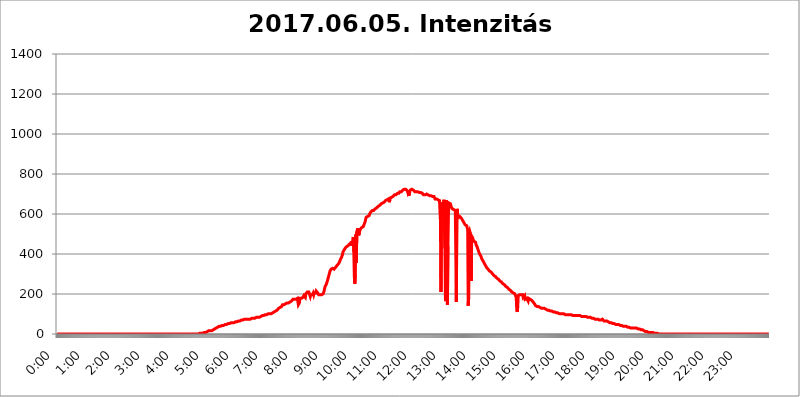
| Category | 2017.06.05. Intenzitás [W/m^2] |
|---|---|
| 0.0 | 0 |
| 0.0006944444444444445 | 0 |
| 0.001388888888888889 | 0 |
| 0.0020833333333333333 | 0 |
| 0.002777777777777778 | 0 |
| 0.003472222222222222 | 0 |
| 0.004166666666666667 | 0 |
| 0.004861111111111111 | 0 |
| 0.005555555555555556 | 0 |
| 0.0062499999999999995 | 0 |
| 0.006944444444444444 | 0 |
| 0.007638888888888889 | 0 |
| 0.008333333333333333 | 0 |
| 0.009027777777777779 | 0 |
| 0.009722222222222222 | 0 |
| 0.010416666666666666 | 0 |
| 0.011111111111111112 | 0 |
| 0.011805555555555555 | 0 |
| 0.012499999999999999 | 0 |
| 0.013194444444444444 | 0 |
| 0.013888888888888888 | 0 |
| 0.014583333333333332 | 0 |
| 0.015277777777777777 | 0 |
| 0.015972222222222224 | 0 |
| 0.016666666666666666 | 0 |
| 0.017361111111111112 | 0 |
| 0.018055555555555557 | 0 |
| 0.01875 | 0 |
| 0.019444444444444445 | 0 |
| 0.02013888888888889 | 0 |
| 0.020833333333333332 | 0 |
| 0.02152777777777778 | 0 |
| 0.022222222222222223 | 0 |
| 0.02291666666666667 | 0 |
| 0.02361111111111111 | 0 |
| 0.024305555555555556 | 0 |
| 0.024999999999999998 | 0 |
| 0.025694444444444447 | 0 |
| 0.02638888888888889 | 0 |
| 0.027083333333333334 | 0 |
| 0.027777777777777776 | 0 |
| 0.02847222222222222 | 0 |
| 0.029166666666666664 | 0 |
| 0.029861111111111113 | 0 |
| 0.030555555555555555 | 0 |
| 0.03125 | 0 |
| 0.03194444444444445 | 0 |
| 0.03263888888888889 | 0 |
| 0.03333333333333333 | 0 |
| 0.034027777777777775 | 0 |
| 0.034722222222222224 | 0 |
| 0.035416666666666666 | 0 |
| 0.036111111111111115 | 0 |
| 0.03680555555555556 | 0 |
| 0.0375 | 0 |
| 0.03819444444444444 | 0 |
| 0.03888888888888889 | 0 |
| 0.03958333333333333 | 0 |
| 0.04027777777777778 | 0 |
| 0.04097222222222222 | 0 |
| 0.041666666666666664 | 0 |
| 0.042361111111111106 | 0 |
| 0.04305555555555556 | 0 |
| 0.043750000000000004 | 0 |
| 0.044444444444444446 | 0 |
| 0.04513888888888889 | 0 |
| 0.04583333333333334 | 0 |
| 0.04652777777777778 | 0 |
| 0.04722222222222222 | 0 |
| 0.04791666666666666 | 0 |
| 0.04861111111111111 | 0 |
| 0.049305555555555554 | 0 |
| 0.049999999999999996 | 0 |
| 0.05069444444444445 | 0 |
| 0.051388888888888894 | 0 |
| 0.052083333333333336 | 0 |
| 0.05277777777777778 | 0 |
| 0.05347222222222222 | 0 |
| 0.05416666666666667 | 0 |
| 0.05486111111111111 | 0 |
| 0.05555555555555555 | 0 |
| 0.05625 | 0 |
| 0.05694444444444444 | 0 |
| 0.057638888888888885 | 0 |
| 0.05833333333333333 | 0 |
| 0.05902777777777778 | 0 |
| 0.059722222222222225 | 0 |
| 0.06041666666666667 | 0 |
| 0.061111111111111116 | 0 |
| 0.06180555555555556 | 0 |
| 0.0625 | 0 |
| 0.06319444444444444 | 0 |
| 0.06388888888888888 | 0 |
| 0.06458333333333334 | 0 |
| 0.06527777777777778 | 0 |
| 0.06597222222222222 | 0 |
| 0.06666666666666667 | 0 |
| 0.06736111111111111 | 0 |
| 0.06805555555555555 | 0 |
| 0.06874999999999999 | 0 |
| 0.06944444444444443 | 0 |
| 0.07013888888888889 | 0 |
| 0.07083333333333333 | 0 |
| 0.07152777777777779 | 0 |
| 0.07222222222222223 | 0 |
| 0.07291666666666667 | 0 |
| 0.07361111111111111 | 0 |
| 0.07430555555555556 | 0 |
| 0.075 | 0 |
| 0.07569444444444444 | 0 |
| 0.0763888888888889 | 0 |
| 0.07708333333333334 | 0 |
| 0.07777777777777778 | 0 |
| 0.07847222222222222 | 0 |
| 0.07916666666666666 | 0 |
| 0.0798611111111111 | 0 |
| 0.08055555555555556 | 0 |
| 0.08125 | 0 |
| 0.08194444444444444 | 0 |
| 0.08263888888888889 | 0 |
| 0.08333333333333333 | 0 |
| 0.08402777777777777 | 0 |
| 0.08472222222222221 | 0 |
| 0.08541666666666665 | 0 |
| 0.08611111111111112 | 0 |
| 0.08680555555555557 | 0 |
| 0.08750000000000001 | 0 |
| 0.08819444444444445 | 0 |
| 0.08888888888888889 | 0 |
| 0.08958333333333333 | 0 |
| 0.09027777777777778 | 0 |
| 0.09097222222222222 | 0 |
| 0.09166666666666667 | 0 |
| 0.09236111111111112 | 0 |
| 0.09305555555555556 | 0 |
| 0.09375 | 0 |
| 0.09444444444444444 | 0 |
| 0.09513888888888888 | 0 |
| 0.09583333333333333 | 0 |
| 0.09652777777777777 | 0 |
| 0.09722222222222222 | 0 |
| 0.09791666666666667 | 0 |
| 0.09861111111111111 | 0 |
| 0.09930555555555555 | 0 |
| 0.09999999999999999 | 0 |
| 0.10069444444444443 | 0 |
| 0.1013888888888889 | 0 |
| 0.10208333333333335 | 0 |
| 0.10277777777777779 | 0 |
| 0.10347222222222223 | 0 |
| 0.10416666666666667 | 0 |
| 0.10486111111111111 | 0 |
| 0.10555555555555556 | 0 |
| 0.10625 | 0 |
| 0.10694444444444444 | 0 |
| 0.1076388888888889 | 0 |
| 0.10833333333333334 | 0 |
| 0.10902777777777778 | 0 |
| 0.10972222222222222 | 0 |
| 0.1111111111111111 | 0 |
| 0.11180555555555556 | 0 |
| 0.11180555555555556 | 0 |
| 0.1125 | 0 |
| 0.11319444444444444 | 0 |
| 0.11388888888888889 | 0 |
| 0.11458333333333333 | 0 |
| 0.11527777777777777 | 0 |
| 0.11597222222222221 | 0 |
| 0.11666666666666665 | 0 |
| 0.1173611111111111 | 0 |
| 0.11805555555555557 | 0 |
| 0.11944444444444445 | 0 |
| 0.12013888888888889 | 0 |
| 0.12083333333333333 | 0 |
| 0.12152777777777778 | 0 |
| 0.12222222222222223 | 0 |
| 0.12291666666666667 | 0 |
| 0.12291666666666667 | 0 |
| 0.12361111111111112 | 0 |
| 0.12430555555555556 | 0 |
| 0.125 | 0 |
| 0.12569444444444444 | 0 |
| 0.12638888888888888 | 0 |
| 0.12708333333333333 | 0 |
| 0.16875 | 0 |
| 0.12847222222222224 | 0 |
| 0.12916666666666668 | 0 |
| 0.12986111111111112 | 0 |
| 0.13055555555555556 | 0 |
| 0.13125 | 0 |
| 0.13194444444444445 | 0 |
| 0.1326388888888889 | 0 |
| 0.13333333333333333 | 0 |
| 0.13402777777777777 | 0 |
| 0.13402777777777777 | 0 |
| 0.13472222222222222 | 0 |
| 0.13541666666666666 | 0 |
| 0.1361111111111111 | 0 |
| 0.13749999999999998 | 0 |
| 0.13819444444444443 | 0 |
| 0.1388888888888889 | 0 |
| 0.13958333333333334 | 0 |
| 0.14027777777777778 | 0 |
| 0.14097222222222222 | 0 |
| 0.14166666666666666 | 0 |
| 0.1423611111111111 | 0 |
| 0.14305555555555557 | 0 |
| 0.14375000000000002 | 0 |
| 0.14444444444444446 | 0 |
| 0.1451388888888889 | 0 |
| 0.1451388888888889 | 0 |
| 0.14652777777777778 | 0 |
| 0.14722222222222223 | 0 |
| 0.14791666666666667 | 0 |
| 0.1486111111111111 | 0 |
| 0.14930555555555555 | 0 |
| 0.15 | 0 |
| 0.15069444444444444 | 0 |
| 0.15138888888888888 | 0 |
| 0.15208333333333332 | 0 |
| 0.15277777777777776 | 0 |
| 0.15347222222222223 | 0 |
| 0.15416666666666667 | 0 |
| 0.15486111111111112 | 0 |
| 0.15555555555555556 | 0 |
| 0.15625 | 0 |
| 0.15694444444444444 | 0 |
| 0.15763888888888888 | 0 |
| 0.15833333333333333 | 0 |
| 0.15902777777777777 | 0 |
| 0.15972222222222224 | 0 |
| 0.16041666666666668 | 0 |
| 0.16111111111111112 | 0 |
| 0.16180555555555556 | 0 |
| 0.1625 | 0 |
| 0.16319444444444445 | 0 |
| 0.1638888888888889 | 0 |
| 0.16458333333333333 | 0 |
| 0.16527777777777777 | 0 |
| 0.16597222222222222 | 0 |
| 0.16666666666666666 | 0 |
| 0.1673611111111111 | 0 |
| 0.16805555555555554 | 0 |
| 0.16874999999999998 | 0 |
| 0.16944444444444443 | 0 |
| 0.17013888888888887 | 0 |
| 0.1708333333333333 | 0 |
| 0.17152777777777775 | 0 |
| 0.17222222222222225 | 0 |
| 0.1729166666666667 | 0 |
| 0.17361111111111113 | 0 |
| 0.17430555555555557 | 0 |
| 0.17500000000000002 | 0 |
| 0.17569444444444446 | 0 |
| 0.1763888888888889 | 0 |
| 0.17708333333333334 | 0 |
| 0.17777777777777778 | 0 |
| 0.17847222222222223 | 0 |
| 0.17916666666666667 | 0 |
| 0.1798611111111111 | 0 |
| 0.18055555555555555 | 0 |
| 0.18125 | 0 |
| 0.18194444444444444 | 0 |
| 0.1826388888888889 | 0 |
| 0.18333333333333335 | 0 |
| 0.1840277777777778 | 0 |
| 0.18472222222222223 | 0 |
| 0.18541666666666667 | 0 |
| 0.18611111111111112 | 0 |
| 0.18680555555555556 | 0 |
| 0.1875 | 0 |
| 0.18819444444444444 | 0 |
| 0.18888888888888888 | 0 |
| 0.18958333333333333 | 0 |
| 0.19027777777777777 | 0 |
| 0.1909722222222222 | 0 |
| 0.19166666666666665 | 0 |
| 0.19236111111111112 | 0 |
| 0.19305555555555554 | 0 |
| 0.19375 | 0 |
| 0.19444444444444445 | 0 |
| 0.1951388888888889 | 0 |
| 0.19583333333333333 | 0 |
| 0.19652777777777777 | 0 |
| 0.19722222222222222 | 0 |
| 0.19791666666666666 | 0 |
| 0.1986111111111111 | 0 |
| 0.19930555555555554 | 3.525 |
| 0.19999999999999998 | 3.525 |
| 0.20069444444444443 | 3.525 |
| 0.20138888888888887 | 3.525 |
| 0.2020833333333333 | 3.525 |
| 0.2027777777777778 | 3.525 |
| 0.2034722222222222 | 3.525 |
| 0.2041666666666667 | 3.525 |
| 0.20486111111111113 | 3.525 |
| 0.20555555555555557 | 7.887 |
| 0.20625000000000002 | 7.887 |
| 0.20694444444444446 | 7.887 |
| 0.2076388888888889 | 7.887 |
| 0.20833333333333334 | 7.887 |
| 0.20902777777777778 | 7.887 |
| 0.20972222222222223 | 12.257 |
| 0.21041666666666667 | 12.257 |
| 0.2111111111111111 | 12.257 |
| 0.21180555555555555 | 16.636 |
| 0.2125 | 16.636 |
| 0.21319444444444444 | 16.636 |
| 0.2138888888888889 | 16.636 |
| 0.21458333333333335 | 16.636 |
| 0.2152777777777778 | 16.636 |
| 0.21597222222222223 | 16.636 |
| 0.21666666666666667 | 16.636 |
| 0.21736111111111112 | 16.636 |
| 0.21805555555555556 | 21.024 |
| 0.21875 | 21.024 |
| 0.21944444444444444 | 21.024 |
| 0.22013888888888888 | 21.024 |
| 0.22083333333333333 | 25.419 |
| 0.22152777777777777 | 29.823 |
| 0.2222222222222222 | 29.823 |
| 0.22291666666666665 | 29.823 |
| 0.2236111111111111 | 29.823 |
| 0.22430555555555556 | 34.234 |
| 0.225 | 34.234 |
| 0.22569444444444445 | 34.234 |
| 0.2263888888888889 | 34.234 |
| 0.22708333333333333 | 38.653 |
| 0.22777777777777777 | 38.653 |
| 0.22847222222222222 | 38.653 |
| 0.22916666666666666 | 38.653 |
| 0.2298611111111111 | 38.653 |
| 0.23055555555555554 | 38.653 |
| 0.23124999999999998 | 43.079 |
| 0.23194444444444443 | 43.079 |
| 0.23263888888888887 | 43.079 |
| 0.2333333333333333 | 43.079 |
| 0.2340277777777778 | 43.079 |
| 0.2347222222222222 | 47.511 |
| 0.2354166666666667 | 47.511 |
| 0.23611111111111113 | 47.511 |
| 0.23680555555555557 | 47.511 |
| 0.23750000000000002 | 47.511 |
| 0.23819444444444446 | 47.511 |
| 0.2388888888888889 | 51.951 |
| 0.23958333333333334 | 51.951 |
| 0.24027777777777778 | 51.951 |
| 0.24097222222222223 | 51.951 |
| 0.24166666666666667 | 51.951 |
| 0.2423611111111111 | 51.951 |
| 0.24305555555555555 | 56.398 |
| 0.24375 | 56.398 |
| 0.24444444444444446 | 56.398 |
| 0.24513888888888888 | 56.398 |
| 0.24583333333333335 | 56.398 |
| 0.2465277777777778 | 56.398 |
| 0.24722222222222223 | 56.398 |
| 0.24791666666666667 | 56.398 |
| 0.24861111111111112 | 60.85 |
| 0.24930555555555556 | 60.85 |
| 0.25 | 60.85 |
| 0.25069444444444444 | 60.85 |
| 0.2513888888888889 | 60.85 |
| 0.2520833333333333 | 60.85 |
| 0.25277777777777777 | 65.31 |
| 0.2534722222222222 | 65.31 |
| 0.25416666666666665 | 65.31 |
| 0.2548611111111111 | 65.31 |
| 0.2555555555555556 | 65.31 |
| 0.25625000000000003 | 65.31 |
| 0.2569444444444445 | 65.31 |
| 0.2576388888888889 | 65.31 |
| 0.25833333333333336 | 69.775 |
| 0.2590277777777778 | 69.775 |
| 0.25972222222222224 | 69.775 |
| 0.2604166666666667 | 69.775 |
| 0.2611111111111111 | 69.775 |
| 0.26180555555555557 | 69.775 |
| 0.2625 | 74.246 |
| 0.26319444444444445 | 74.246 |
| 0.2638888888888889 | 74.246 |
| 0.26458333333333334 | 74.246 |
| 0.2652777777777778 | 74.246 |
| 0.2659722222222222 | 74.246 |
| 0.26666666666666666 | 74.246 |
| 0.2673611111111111 | 74.246 |
| 0.26805555555555555 | 74.246 |
| 0.26875 | 74.246 |
| 0.26944444444444443 | 74.246 |
| 0.2701388888888889 | 74.246 |
| 0.2708333333333333 | 74.246 |
| 0.27152777777777776 | 78.722 |
| 0.2722222222222222 | 78.722 |
| 0.27291666666666664 | 78.722 |
| 0.2736111111111111 | 78.722 |
| 0.2743055555555555 | 78.722 |
| 0.27499999999999997 | 78.722 |
| 0.27569444444444446 | 78.722 |
| 0.27638888888888885 | 78.722 |
| 0.27708333333333335 | 78.722 |
| 0.2777777777777778 | 83.205 |
| 0.27847222222222223 | 83.205 |
| 0.2791666666666667 | 83.205 |
| 0.2798611111111111 | 83.205 |
| 0.28055555555555556 | 83.205 |
| 0.28125 | 83.205 |
| 0.28194444444444444 | 83.205 |
| 0.2826388888888889 | 83.205 |
| 0.2833333333333333 | 83.205 |
| 0.28402777777777777 | 87.692 |
| 0.2847222222222222 | 87.692 |
| 0.28541666666666665 | 87.692 |
| 0.28611111111111115 | 87.692 |
| 0.28680555555555554 | 87.692 |
| 0.28750000000000003 | 92.184 |
| 0.2881944444444445 | 92.184 |
| 0.2888888888888889 | 92.184 |
| 0.28958333333333336 | 92.184 |
| 0.2902777777777778 | 92.184 |
| 0.29097222222222224 | 96.682 |
| 0.2916666666666667 | 96.682 |
| 0.2923611111111111 | 96.682 |
| 0.29305555555555557 | 96.682 |
| 0.29375 | 96.682 |
| 0.29444444444444445 | 101.184 |
| 0.2951388888888889 | 101.184 |
| 0.29583333333333334 | 101.184 |
| 0.2965277777777778 | 101.184 |
| 0.2972222222222222 | 101.184 |
| 0.29791666666666666 | 101.184 |
| 0.2986111111111111 | 101.184 |
| 0.29930555555555555 | 101.184 |
| 0.3 | 101.184 |
| 0.30069444444444443 | 101.184 |
| 0.3013888888888889 | 105.69 |
| 0.3020833333333333 | 105.69 |
| 0.30277777777777776 | 105.69 |
| 0.3034722222222222 | 105.69 |
| 0.30416666666666664 | 110.201 |
| 0.3048611111111111 | 110.201 |
| 0.3055555555555555 | 110.201 |
| 0.30624999999999997 | 114.716 |
| 0.3069444444444444 | 114.716 |
| 0.3076388888888889 | 119.235 |
| 0.30833333333333335 | 119.235 |
| 0.3090277777777778 | 119.235 |
| 0.30972222222222223 | 123.758 |
| 0.3104166666666667 | 128.284 |
| 0.3111111111111111 | 128.284 |
| 0.31180555555555556 | 132.814 |
| 0.3125 | 132.814 |
| 0.31319444444444444 | 137.347 |
| 0.3138888888888889 | 137.347 |
| 0.3145833333333333 | 137.347 |
| 0.31527777777777777 | 141.884 |
| 0.3159722222222222 | 146.423 |
| 0.31666666666666665 | 146.423 |
| 0.31736111111111115 | 146.423 |
| 0.31805555555555554 | 146.423 |
| 0.31875000000000003 | 146.423 |
| 0.3194444444444445 | 150.964 |
| 0.3201388888888889 | 150.964 |
| 0.32083333333333336 | 150.964 |
| 0.3215277777777778 | 150.964 |
| 0.32222222222222224 | 155.509 |
| 0.3229166666666667 | 155.509 |
| 0.3236111111111111 | 155.509 |
| 0.32430555555555557 | 155.509 |
| 0.325 | 160.056 |
| 0.32569444444444445 | 160.056 |
| 0.3263888888888889 | 160.056 |
| 0.32708333333333334 | 164.605 |
| 0.3277777777777778 | 164.605 |
| 0.3284722222222222 | 164.605 |
| 0.32916666666666666 | 169.156 |
| 0.3298611111111111 | 169.156 |
| 0.33055555555555555 | 173.709 |
| 0.33125 | 173.709 |
| 0.33194444444444443 | 173.709 |
| 0.3326388888888889 | 173.709 |
| 0.3333333333333333 | 178.264 |
| 0.3340277777777778 | 178.264 |
| 0.3347222222222222 | 173.709 |
| 0.3354166666666667 | 173.709 |
| 0.3361111111111111 | 178.264 |
| 0.3368055555555556 | 178.264 |
| 0.33749999999999997 | 178.264 |
| 0.33819444444444446 | 146.423 |
| 0.33888888888888885 | 141.884 |
| 0.33958333333333335 | 155.509 |
| 0.34027777777777773 | 178.264 |
| 0.34097222222222223 | 178.264 |
| 0.3416666666666666 | 178.264 |
| 0.3423611111111111 | 178.264 |
| 0.3430555555555555 | 178.264 |
| 0.34375 | 182.82 |
| 0.3444444444444445 | 182.82 |
| 0.3451388888888889 | 187.378 |
| 0.3458333333333334 | 191.937 |
| 0.34652777777777777 | 196.497 |
| 0.34722222222222227 | 196.497 |
| 0.34791666666666665 | 182.82 |
| 0.34861111111111115 | 201.058 |
| 0.34930555555555554 | 201.058 |
| 0.35000000000000003 | 205.62 |
| 0.3506944444444444 | 210.182 |
| 0.3513888888888889 | 210.182 |
| 0.3520833333333333 | 214.746 |
| 0.3527777777777778 | 210.182 |
| 0.3534722222222222 | 210.182 |
| 0.3541666666666667 | 205.62 |
| 0.3548611111111111 | 187.378 |
| 0.35555555555555557 | 196.497 |
| 0.35625 | 196.497 |
| 0.35694444444444445 | 196.497 |
| 0.3576388888888889 | 196.497 |
| 0.35833333333333334 | 201.058 |
| 0.3590277777777778 | 205.62 |
| 0.3597222222222222 | 196.497 |
| 0.36041666666666666 | 205.62 |
| 0.3611111111111111 | 210.182 |
| 0.36180555555555555 | 201.058 |
| 0.3625 | 205.62 |
| 0.36319444444444443 | 214.746 |
| 0.3638888888888889 | 210.182 |
| 0.3645833333333333 | 210.182 |
| 0.3652777777777778 | 205.62 |
| 0.3659722222222222 | 201.058 |
| 0.3666666666666667 | 196.497 |
| 0.3673611111111111 | 191.937 |
| 0.3680555555555556 | 196.497 |
| 0.36874999999999997 | 196.497 |
| 0.36944444444444446 | 196.497 |
| 0.37013888888888885 | 196.497 |
| 0.37083333333333335 | 196.497 |
| 0.37152777777777773 | 196.497 |
| 0.37222222222222223 | 196.497 |
| 0.3729166666666666 | 201.058 |
| 0.3736111111111111 | 205.62 |
| 0.3743055555555555 | 214.746 |
| 0.375 | 228.436 |
| 0.3756944444444445 | 237.564 |
| 0.3763888888888889 | 242.127 |
| 0.3770833333333334 | 246.689 |
| 0.37777777777777777 | 251.251 |
| 0.37847222222222227 | 260.373 |
| 0.37916666666666665 | 269.49 |
| 0.37986111111111115 | 278.603 |
| 0.38055555555555554 | 287.709 |
| 0.38125000000000003 | 296.808 |
| 0.3819444444444444 | 301.354 |
| 0.3826388888888889 | 314.98 |
| 0.3833333333333333 | 319.517 |
| 0.3840277777777778 | 324.052 |
| 0.3847222222222222 | 324.052 |
| 0.3854166666666667 | 328.584 |
| 0.3861111111111111 | 328.584 |
| 0.38680555555555557 | 328.584 |
| 0.3875 | 324.052 |
| 0.38819444444444445 | 324.052 |
| 0.3888888888888889 | 324.052 |
| 0.38958333333333334 | 328.584 |
| 0.3902777777777778 | 333.113 |
| 0.3909722222222222 | 337.639 |
| 0.39166666666666666 | 337.639 |
| 0.3923611111111111 | 342.162 |
| 0.39305555555555555 | 346.682 |
| 0.39375 | 346.682 |
| 0.39444444444444443 | 351.198 |
| 0.3951388888888889 | 355.712 |
| 0.3958333333333333 | 360.221 |
| 0.3965277777777778 | 364.728 |
| 0.3972222222222222 | 373.729 |
| 0.3979166666666667 | 378.224 |
| 0.3986111111111111 | 382.715 |
| 0.3993055555555556 | 387.202 |
| 0.39999999999999997 | 396.164 |
| 0.40069444444444446 | 409.574 |
| 0.40138888888888885 | 414.035 |
| 0.40208333333333335 | 418.492 |
| 0.40277777777777773 | 422.943 |
| 0.40347222222222223 | 427.39 |
| 0.4041666666666666 | 431.833 |
| 0.4048611111111111 | 431.833 |
| 0.4055555555555555 | 436.27 |
| 0.40625 | 436.27 |
| 0.4069444444444445 | 440.702 |
| 0.4076388888888889 | 440.702 |
| 0.4083333333333334 | 445.129 |
| 0.40902777777777777 | 445.129 |
| 0.40972222222222227 | 449.551 |
| 0.41041666666666665 | 445.129 |
| 0.41111111111111115 | 449.551 |
| 0.41180555555555554 | 453.968 |
| 0.41250000000000003 | 462.786 |
| 0.4131944444444444 | 440.702 |
| 0.4138888888888889 | 458.38 |
| 0.4145833333333333 | 471.582 |
| 0.4152777777777778 | 484.735 |
| 0.4159722222222222 | 409.574 |
| 0.4166666666666667 | 287.709 |
| 0.4173611111111111 | 251.251 |
| 0.41805555555555557 | 296.808 |
| 0.41875 | 497.836 |
| 0.41944444444444445 | 355.712 |
| 0.4201388888888889 | 510.885 |
| 0.42083333333333334 | 515.223 |
| 0.4215277777777778 | 528.2 |
| 0.4222222222222222 | 532.513 |
| 0.42291666666666666 | 493.475 |
| 0.4236111111111111 | 523.88 |
| 0.42430555555555555 | 515.223 |
| 0.425 | 523.88 |
| 0.42569444444444443 | 528.2 |
| 0.4263888888888889 | 528.2 |
| 0.4270833333333333 | 532.513 |
| 0.4277777777777778 | 532.513 |
| 0.4284722222222222 | 532.513 |
| 0.4291666666666667 | 536.82 |
| 0.4298611111111111 | 541.121 |
| 0.4305555555555556 | 549.704 |
| 0.43124999999999997 | 553.986 |
| 0.43194444444444446 | 562.53 |
| 0.43263888888888885 | 575.299 |
| 0.43333333333333335 | 583.779 |
| 0.43402777777777773 | 583.779 |
| 0.43472222222222223 | 583.779 |
| 0.4354166666666666 | 588.009 |
| 0.4361111111111111 | 588.009 |
| 0.4368055555555555 | 588.009 |
| 0.4375 | 592.233 |
| 0.4381944444444445 | 600.661 |
| 0.4388888888888889 | 604.864 |
| 0.4395833333333334 | 609.062 |
| 0.44027777777777777 | 609.062 |
| 0.44097222222222227 | 613.252 |
| 0.44166666666666665 | 617.436 |
| 0.44236111111111115 | 617.436 |
| 0.44305555555555554 | 617.436 |
| 0.44375000000000003 | 617.436 |
| 0.4444444444444444 | 621.613 |
| 0.4451388888888889 | 621.613 |
| 0.4458333333333333 | 625.784 |
| 0.4465277777777778 | 625.784 |
| 0.4472222222222222 | 629.948 |
| 0.4479166666666667 | 629.948 |
| 0.4486111111111111 | 629.948 |
| 0.44930555555555557 | 634.105 |
| 0.45 | 638.256 |
| 0.45069444444444445 | 638.256 |
| 0.4513888888888889 | 638.256 |
| 0.45208333333333334 | 642.4 |
| 0.4527777777777778 | 646.537 |
| 0.4534722222222222 | 646.537 |
| 0.45416666666666666 | 650.667 |
| 0.4548611111111111 | 650.667 |
| 0.45555555555555555 | 650.667 |
| 0.45625 | 654.791 |
| 0.45694444444444443 | 654.791 |
| 0.4576388888888889 | 658.909 |
| 0.4583333333333333 | 658.909 |
| 0.4590277777777778 | 663.019 |
| 0.4597222222222222 | 663.019 |
| 0.4604166666666667 | 667.123 |
| 0.4611111111111111 | 667.123 |
| 0.4618055555555556 | 667.123 |
| 0.46249999999999997 | 671.22 |
| 0.46319444444444446 | 675.311 |
| 0.46388888888888885 | 675.311 |
| 0.46458333333333335 | 675.311 |
| 0.46527777777777773 | 675.311 |
| 0.46597222222222223 | 658.909 |
| 0.4666666666666666 | 679.395 |
| 0.4673611111111111 | 683.473 |
| 0.4680555555555555 | 683.473 |
| 0.46875 | 683.473 |
| 0.4694444444444445 | 687.544 |
| 0.4701388888888889 | 687.544 |
| 0.4708333333333334 | 687.544 |
| 0.47152777777777777 | 691.608 |
| 0.47222222222222227 | 691.608 |
| 0.47291666666666665 | 695.666 |
| 0.47361111111111115 | 695.666 |
| 0.47430555555555554 | 695.666 |
| 0.47500000000000003 | 695.666 |
| 0.4756944444444444 | 699.717 |
| 0.4763888888888889 | 699.717 |
| 0.4770833333333333 | 703.762 |
| 0.4777777777777778 | 703.762 |
| 0.4784722222222222 | 707.8 |
| 0.4791666666666667 | 703.762 |
| 0.4798611111111111 | 707.8 |
| 0.48055555555555557 | 711.832 |
| 0.48125 | 711.832 |
| 0.48194444444444445 | 711.832 |
| 0.4826388888888889 | 711.832 |
| 0.48333333333333334 | 715.858 |
| 0.4840277777777778 | 715.858 |
| 0.4847222222222222 | 719.877 |
| 0.48541666666666666 | 719.877 |
| 0.4861111111111111 | 719.877 |
| 0.48680555555555555 | 723.889 |
| 0.4875 | 723.889 |
| 0.48819444444444443 | 723.889 |
| 0.4888888888888889 | 723.889 |
| 0.4895833333333333 | 719.877 |
| 0.4902777777777778 | 719.877 |
| 0.4909722222222222 | 715.858 |
| 0.4916666666666667 | 707.8 |
| 0.4923611111111111 | 715.858 |
| 0.4930555555555556 | 691.608 |
| 0.49374999999999997 | 691.608 |
| 0.49444444444444446 | 711.832 |
| 0.49513888888888885 | 719.877 |
| 0.49583333333333335 | 723.889 |
| 0.49652777777777773 | 723.889 |
| 0.49722222222222223 | 723.889 |
| 0.4979166666666666 | 719.877 |
| 0.4986111111111111 | 719.877 |
| 0.4993055555555555 | 719.877 |
| 0.5 | 719.877 |
| 0.5006944444444444 | 715.858 |
| 0.5013888888888889 | 711.832 |
| 0.5020833333333333 | 711.832 |
| 0.5027777777777778 | 711.832 |
| 0.5034722222222222 | 711.832 |
| 0.5041666666666667 | 711.832 |
| 0.5048611111111111 | 711.832 |
| 0.5055555555555555 | 711.832 |
| 0.50625 | 711.832 |
| 0.5069444444444444 | 711.832 |
| 0.5076388888888889 | 707.8 |
| 0.5083333333333333 | 707.8 |
| 0.5090277777777777 | 703.762 |
| 0.5097222222222222 | 707.8 |
| 0.5104166666666666 | 707.8 |
| 0.5111111111111112 | 703.762 |
| 0.5118055555555555 | 703.762 |
| 0.5125000000000001 | 703.762 |
| 0.5131944444444444 | 699.717 |
| 0.513888888888889 | 695.666 |
| 0.5145833333333333 | 695.666 |
| 0.5152777777777778 | 695.666 |
| 0.5159722222222222 | 695.666 |
| 0.5166666666666667 | 695.666 |
| 0.517361111111111 | 695.666 |
| 0.5180555555555556 | 699.717 |
| 0.5187499999999999 | 695.666 |
| 0.5194444444444445 | 695.666 |
| 0.5201388888888888 | 695.666 |
| 0.5208333333333334 | 695.666 |
| 0.5215277777777778 | 695.666 |
| 0.5222222222222223 | 691.608 |
| 0.5229166666666667 | 695.666 |
| 0.5236111111111111 | 695.666 |
| 0.5243055555555556 | 691.608 |
| 0.525 | 695.666 |
| 0.5256944444444445 | 691.608 |
| 0.5263888888888889 | 687.544 |
| 0.5270833333333333 | 687.544 |
| 0.5277777777777778 | 687.544 |
| 0.5284722222222222 | 687.544 |
| 0.5291666666666667 | 683.473 |
| 0.5298611111111111 | 675.311 |
| 0.5305555555555556 | 675.311 |
| 0.53125 | 679.395 |
| 0.5319444444444444 | 675.311 |
| 0.5326388888888889 | 671.22 |
| 0.5333333333333333 | 675.311 |
| 0.5340277777777778 | 671.22 |
| 0.5347222222222222 | 671.22 |
| 0.5354166666666667 | 667.123 |
| 0.5361111111111111 | 667.123 |
| 0.5368055555555555 | 667.123 |
| 0.5375 | 562.53 |
| 0.5381944444444444 | 210.182 |
| 0.5388888888888889 | 642.4 |
| 0.5395833333333333 | 658.909 |
| 0.5402777777777777 | 654.791 |
| 0.5409722222222222 | 596.45 |
| 0.5416666666666666 | 638.256 |
| 0.5423611111111112 | 671.22 |
| 0.5430555555555555 | 675.311 |
| 0.5437500000000001 | 427.39 |
| 0.5444444444444444 | 173.709 |
| 0.545138888888889 | 164.605 |
| 0.5458333333333333 | 667.123 |
| 0.5465277777777778 | 296.808 |
| 0.5472222222222222 | 146.423 |
| 0.5479166666666667 | 440.702 |
| 0.548611111111111 | 592.233 |
| 0.5493055555555556 | 654.791 |
| 0.5499999999999999 | 654.791 |
| 0.5506944444444445 | 658.909 |
| 0.5513888888888888 | 650.667 |
| 0.5520833333333334 | 646.537 |
| 0.5527777777777778 | 634.105 |
| 0.5534722222222223 | 638.256 |
| 0.5541666666666667 | 625.784 |
| 0.5548611111111111 | 621.613 |
| 0.5555555555555556 | 621.613 |
| 0.55625 | 621.613 |
| 0.5569444444444445 | 621.613 |
| 0.5576388888888889 | 621.613 |
| 0.5583333333333333 | 617.436 |
| 0.5590277777777778 | 621.613 |
| 0.5597222222222222 | 160.056 |
| 0.5604166666666667 | 592.233 |
| 0.5611111111111111 | 625.784 |
| 0.5618055555555556 | 575.299 |
| 0.5625 | 592.233 |
| 0.5631944444444444 | 596.45 |
| 0.5638888888888889 | 592.233 |
| 0.5645833333333333 | 588.009 |
| 0.5652777777777778 | 583.779 |
| 0.5659722222222222 | 583.779 |
| 0.5666666666666667 | 579.542 |
| 0.5673611111111111 | 575.299 |
| 0.5680555555555555 | 571.049 |
| 0.56875 | 571.049 |
| 0.5694444444444444 | 562.53 |
| 0.5701388888888889 | 558.261 |
| 0.5708333333333333 | 553.986 |
| 0.5715277777777777 | 553.986 |
| 0.5722222222222222 | 545.416 |
| 0.5729166666666666 | 541.121 |
| 0.5736111111111112 | 541.121 |
| 0.5743055555555555 | 541.121 |
| 0.5750000000000001 | 541.121 |
| 0.5756944444444444 | 519.555 |
| 0.576388888888889 | 141.884 |
| 0.5770833333333333 | 182.82 |
| 0.5777777777777778 | 506.542 |
| 0.5784722222222222 | 515.223 |
| 0.5791666666666667 | 506.542 |
| 0.579861111111111 | 489.108 |
| 0.5805555555555556 | 264.932 |
| 0.5812499999999999 | 489.108 |
| 0.5819444444444445 | 484.735 |
| 0.5826388888888888 | 480.356 |
| 0.5833333333333334 | 471.582 |
| 0.5840277777777778 | 471.582 |
| 0.5847222222222223 | 462.786 |
| 0.5854166666666667 | 458.38 |
| 0.5861111111111111 | 458.38 |
| 0.5868055555555556 | 458.38 |
| 0.5875 | 445.129 |
| 0.5881944444444445 | 440.702 |
| 0.5888888888888889 | 436.27 |
| 0.5895833333333333 | 427.39 |
| 0.5902777777777778 | 422.943 |
| 0.5909722222222222 | 414.035 |
| 0.5916666666666667 | 405.108 |
| 0.5923611111111111 | 400.638 |
| 0.5930555555555556 | 396.164 |
| 0.59375 | 391.685 |
| 0.5944444444444444 | 387.202 |
| 0.5951388888888889 | 378.224 |
| 0.5958333333333333 | 373.729 |
| 0.5965277777777778 | 369.23 |
| 0.5972222222222222 | 364.728 |
| 0.5979166666666667 | 360.221 |
| 0.5986111111111111 | 355.712 |
| 0.5993055555555555 | 351.198 |
| 0.6 | 346.682 |
| 0.6006944444444444 | 342.162 |
| 0.6013888888888889 | 337.639 |
| 0.6020833333333333 | 333.113 |
| 0.6027777777777777 | 333.113 |
| 0.6034722222222222 | 328.584 |
| 0.6041666666666666 | 324.052 |
| 0.6048611111111112 | 324.052 |
| 0.6055555555555555 | 319.517 |
| 0.6062500000000001 | 314.98 |
| 0.6069444444444444 | 314.98 |
| 0.607638888888889 | 310.44 |
| 0.6083333333333333 | 310.44 |
| 0.6090277777777778 | 305.898 |
| 0.6097222222222222 | 305.898 |
| 0.6104166666666667 | 301.354 |
| 0.611111111111111 | 296.808 |
| 0.6118055555555556 | 296.808 |
| 0.6124999999999999 | 292.259 |
| 0.6131944444444445 | 292.259 |
| 0.6138888888888888 | 287.709 |
| 0.6145833333333334 | 287.709 |
| 0.6152777777777778 | 287.709 |
| 0.6159722222222223 | 283.156 |
| 0.6166666666666667 | 278.603 |
| 0.6173611111111111 | 278.603 |
| 0.6180555555555556 | 274.047 |
| 0.61875 | 274.047 |
| 0.6194444444444445 | 269.49 |
| 0.6201388888888889 | 269.49 |
| 0.6208333333333333 | 264.932 |
| 0.6215277777777778 | 264.932 |
| 0.6222222222222222 | 260.373 |
| 0.6229166666666667 | 260.373 |
| 0.6236111111111111 | 255.813 |
| 0.6243055555555556 | 255.813 |
| 0.625 | 251.251 |
| 0.6256944444444444 | 251.251 |
| 0.6263888888888889 | 246.689 |
| 0.6270833333333333 | 246.689 |
| 0.6277777777777778 | 242.127 |
| 0.6284722222222222 | 242.127 |
| 0.6291666666666667 | 237.564 |
| 0.6298611111111111 | 237.564 |
| 0.6305555555555555 | 233 |
| 0.63125 | 233 |
| 0.6319444444444444 | 228.436 |
| 0.6326388888888889 | 228.436 |
| 0.6333333333333333 | 223.873 |
| 0.6340277777777777 | 223.873 |
| 0.6347222222222222 | 219.309 |
| 0.6354166666666666 | 219.309 |
| 0.6361111111111112 | 214.746 |
| 0.6368055555555555 | 214.746 |
| 0.6375000000000001 | 210.182 |
| 0.6381944444444444 | 210.182 |
| 0.638888888888889 | 210.182 |
| 0.6395833333333333 | 205.62 |
| 0.6402777777777778 | 205.62 |
| 0.6409722222222222 | 201.058 |
| 0.6416666666666667 | 201.058 |
| 0.642361111111111 | 201.058 |
| 0.6430555555555556 | 196.497 |
| 0.6437499999999999 | 182.82 |
| 0.6444444444444445 | 123.758 |
| 0.6451388888888888 | 110.201 |
| 0.6458333333333334 | 137.347 |
| 0.6465277777777778 | 191.937 |
| 0.6472222222222223 | 196.497 |
| 0.6479166666666667 | 196.497 |
| 0.6486111111111111 | 196.497 |
| 0.6493055555555556 | 196.497 |
| 0.65 | 196.497 |
| 0.6506944444444445 | 196.497 |
| 0.6513888888888889 | 196.497 |
| 0.6520833333333333 | 196.497 |
| 0.6527777777777778 | 196.497 |
| 0.6534722222222222 | 182.82 |
| 0.6541666666666667 | 182.82 |
| 0.6548611111111111 | 187.378 |
| 0.6555555555555556 | 191.937 |
| 0.65625 | 173.709 |
| 0.6569444444444444 | 173.709 |
| 0.6576388888888889 | 169.156 |
| 0.6583333333333333 | 178.264 |
| 0.6590277777777778 | 178.264 |
| 0.6597222222222222 | 182.82 |
| 0.6604166666666667 | 164.605 |
| 0.6611111111111111 | 178.264 |
| 0.6618055555555555 | 178.264 |
| 0.6625 | 173.709 |
| 0.6631944444444444 | 173.709 |
| 0.6638888888888889 | 173.709 |
| 0.6645833333333333 | 169.156 |
| 0.6652777777777777 | 169.156 |
| 0.6659722222222222 | 164.605 |
| 0.6666666666666666 | 164.605 |
| 0.6673611111111111 | 160.056 |
| 0.6680555555555556 | 155.509 |
| 0.6687500000000001 | 155.509 |
| 0.6694444444444444 | 150.964 |
| 0.6701388888888888 | 146.423 |
| 0.6708333333333334 | 141.884 |
| 0.6715277777777778 | 137.347 |
| 0.6722222222222222 | 137.347 |
| 0.6729166666666666 | 137.347 |
| 0.6736111111111112 | 137.347 |
| 0.6743055555555556 | 137.347 |
| 0.6749999999999999 | 137.347 |
| 0.6756944444444444 | 137.347 |
| 0.6763888888888889 | 132.814 |
| 0.6770833333333334 | 132.814 |
| 0.6777777777777777 | 132.814 |
| 0.6784722222222223 | 128.284 |
| 0.6791666666666667 | 128.284 |
| 0.6798611111111111 | 128.284 |
| 0.6805555555555555 | 128.284 |
| 0.68125 | 128.284 |
| 0.6819444444444445 | 128.284 |
| 0.6826388888888889 | 128.284 |
| 0.6833333333333332 | 128.284 |
| 0.6840277777777778 | 123.758 |
| 0.6847222222222222 | 123.758 |
| 0.6854166666666667 | 123.758 |
| 0.686111111111111 | 123.758 |
| 0.6868055555555556 | 119.235 |
| 0.6875 | 119.235 |
| 0.6881944444444444 | 119.235 |
| 0.688888888888889 | 119.235 |
| 0.6895833333333333 | 119.235 |
| 0.6902777777777778 | 119.235 |
| 0.6909722222222222 | 114.716 |
| 0.6916666666666668 | 114.716 |
| 0.6923611111111111 | 114.716 |
| 0.6930555555555555 | 114.716 |
| 0.69375 | 114.716 |
| 0.6944444444444445 | 110.201 |
| 0.6951388888888889 | 110.201 |
| 0.6958333333333333 | 110.201 |
| 0.6965277777777777 | 110.201 |
| 0.6972222222222223 | 110.201 |
| 0.6979166666666666 | 110.201 |
| 0.6986111111111111 | 110.201 |
| 0.6993055555555556 | 110.201 |
| 0.7000000000000001 | 105.69 |
| 0.7006944444444444 | 105.69 |
| 0.7013888888888888 | 105.69 |
| 0.7020833333333334 | 105.69 |
| 0.7027777777777778 | 101.184 |
| 0.7034722222222222 | 101.184 |
| 0.7041666666666666 | 101.184 |
| 0.7048611111111112 | 101.184 |
| 0.7055555555555556 | 101.184 |
| 0.7062499999999999 | 101.184 |
| 0.7069444444444444 | 101.184 |
| 0.7076388888888889 | 101.184 |
| 0.7083333333333334 | 101.184 |
| 0.7090277777777777 | 101.184 |
| 0.7097222222222223 | 101.184 |
| 0.7104166666666667 | 101.184 |
| 0.7111111111111111 | 101.184 |
| 0.7118055555555555 | 96.682 |
| 0.7125 | 96.682 |
| 0.7131944444444445 | 101.184 |
| 0.7138888888888889 | 96.682 |
| 0.7145833333333332 | 96.682 |
| 0.7152777777777778 | 96.682 |
| 0.7159722222222222 | 96.682 |
| 0.7166666666666667 | 96.682 |
| 0.717361111111111 | 96.682 |
| 0.7180555555555556 | 96.682 |
| 0.71875 | 96.682 |
| 0.7194444444444444 | 96.682 |
| 0.720138888888889 | 96.682 |
| 0.7208333333333333 | 96.682 |
| 0.7215277777777778 | 96.682 |
| 0.7222222222222222 | 96.682 |
| 0.7229166666666668 | 92.184 |
| 0.7236111111111111 | 92.184 |
| 0.7243055555555555 | 92.184 |
| 0.725 | 92.184 |
| 0.7256944444444445 | 92.184 |
| 0.7263888888888889 | 92.184 |
| 0.7270833333333333 | 92.184 |
| 0.7277777777777777 | 92.184 |
| 0.7284722222222223 | 92.184 |
| 0.7291666666666666 | 92.184 |
| 0.7298611111111111 | 92.184 |
| 0.7305555555555556 | 92.184 |
| 0.7312500000000001 | 92.184 |
| 0.7319444444444444 | 92.184 |
| 0.7326388888888888 | 92.184 |
| 0.7333333333333334 | 92.184 |
| 0.7340277777777778 | 92.184 |
| 0.7347222222222222 | 87.692 |
| 0.7354166666666666 | 87.692 |
| 0.7361111111111112 | 87.692 |
| 0.7368055555555556 | 87.692 |
| 0.7374999999999999 | 87.692 |
| 0.7381944444444444 | 87.692 |
| 0.7388888888888889 | 87.692 |
| 0.7395833333333334 | 87.692 |
| 0.7402777777777777 | 87.692 |
| 0.7409722222222223 | 83.205 |
| 0.7416666666666667 | 87.692 |
| 0.7423611111111111 | 83.205 |
| 0.7430555555555555 | 83.205 |
| 0.74375 | 83.205 |
| 0.7444444444444445 | 83.205 |
| 0.7451388888888889 | 83.205 |
| 0.7458333333333332 | 83.205 |
| 0.7465277777777778 | 83.205 |
| 0.7472222222222222 | 83.205 |
| 0.7479166666666667 | 83.205 |
| 0.748611111111111 | 78.722 |
| 0.7493055555555556 | 78.722 |
| 0.75 | 78.722 |
| 0.7506944444444444 | 78.722 |
| 0.751388888888889 | 78.722 |
| 0.7520833333333333 | 78.722 |
| 0.7527777777777778 | 74.246 |
| 0.7534722222222222 | 74.246 |
| 0.7541666666666668 | 74.246 |
| 0.7548611111111111 | 74.246 |
| 0.7555555555555555 | 74.246 |
| 0.75625 | 74.246 |
| 0.7569444444444445 | 74.246 |
| 0.7576388888888889 | 74.246 |
| 0.7583333333333333 | 74.246 |
| 0.7590277777777777 | 69.775 |
| 0.7597222222222223 | 69.775 |
| 0.7604166666666666 | 69.775 |
| 0.7611111111111111 | 69.775 |
| 0.7618055555555556 | 69.775 |
| 0.7625000000000001 | 69.775 |
| 0.7631944444444444 | 69.775 |
| 0.7638888888888888 | 69.775 |
| 0.7645833333333334 | 74.246 |
| 0.7652777777777778 | 74.246 |
| 0.7659722222222222 | 69.775 |
| 0.7666666666666666 | 65.31 |
| 0.7673611111111112 | 65.31 |
| 0.7680555555555556 | 65.31 |
| 0.7687499999999999 | 65.31 |
| 0.7694444444444444 | 65.31 |
| 0.7701388888888889 | 65.31 |
| 0.7708333333333334 | 65.31 |
| 0.7715277777777777 | 65.31 |
| 0.7722222222222223 | 60.85 |
| 0.7729166666666667 | 60.85 |
| 0.7736111111111111 | 60.85 |
| 0.7743055555555555 | 56.398 |
| 0.775 | 56.398 |
| 0.7756944444444445 | 56.398 |
| 0.7763888888888889 | 56.398 |
| 0.7770833333333332 | 56.398 |
| 0.7777777777777778 | 56.398 |
| 0.7784722222222222 | 56.398 |
| 0.7791666666666667 | 51.951 |
| 0.779861111111111 | 51.951 |
| 0.7805555555555556 | 51.951 |
| 0.78125 | 51.951 |
| 0.7819444444444444 | 51.951 |
| 0.782638888888889 | 47.511 |
| 0.7833333333333333 | 47.511 |
| 0.7840277777777778 | 47.511 |
| 0.7847222222222222 | 47.511 |
| 0.7854166666666668 | 47.511 |
| 0.7861111111111111 | 47.511 |
| 0.7868055555555555 | 47.511 |
| 0.7875 | 47.511 |
| 0.7881944444444445 | 43.079 |
| 0.7888888888888889 | 43.079 |
| 0.7895833333333333 | 43.079 |
| 0.7902777777777777 | 43.079 |
| 0.7909722222222223 | 43.079 |
| 0.7916666666666666 | 43.079 |
| 0.7923611111111111 | 43.079 |
| 0.7930555555555556 | 38.653 |
| 0.7937500000000001 | 38.653 |
| 0.7944444444444444 | 43.079 |
| 0.7951388888888888 | 38.653 |
| 0.7958333333333334 | 38.653 |
| 0.7965277777777778 | 38.653 |
| 0.7972222222222222 | 38.653 |
| 0.7979166666666666 | 38.653 |
| 0.7986111111111112 | 38.653 |
| 0.7993055555555556 | 34.234 |
| 0.7999999999999999 | 34.234 |
| 0.8006944444444444 | 34.234 |
| 0.8013888888888889 | 34.234 |
| 0.8020833333333334 | 34.234 |
| 0.8027777777777777 | 34.234 |
| 0.8034722222222223 | 34.234 |
| 0.8041666666666667 | 29.823 |
| 0.8048611111111111 | 29.823 |
| 0.8055555555555555 | 29.823 |
| 0.80625 | 29.823 |
| 0.8069444444444445 | 29.823 |
| 0.8076388888888889 | 29.823 |
| 0.8083333333333332 | 29.823 |
| 0.8090277777777778 | 29.823 |
| 0.8097222222222222 | 29.823 |
| 0.8104166666666667 | 29.823 |
| 0.811111111111111 | 29.823 |
| 0.8118055555555556 | 29.823 |
| 0.8125 | 29.823 |
| 0.8131944444444444 | 29.823 |
| 0.813888888888889 | 29.823 |
| 0.8145833333333333 | 25.419 |
| 0.8152777777777778 | 25.419 |
| 0.8159722222222222 | 25.419 |
| 0.8166666666666668 | 25.419 |
| 0.8173611111111111 | 21.024 |
| 0.8180555555555555 | 21.024 |
| 0.81875 | 21.024 |
| 0.8194444444444445 | 21.024 |
| 0.8201388888888889 | 21.024 |
| 0.8208333333333333 | 21.024 |
| 0.8215277777777777 | 21.024 |
| 0.8222222222222223 | 16.636 |
| 0.8229166666666666 | 16.636 |
| 0.8236111111111111 | 16.636 |
| 0.8243055555555556 | 16.636 |
| 0.8250000000000001 | 12.257 |
| 0.8256944444444444 | 12.257 |
| 0.8263888888888888 | 12.257 |
| 0.8270833333333334 | 12.257 |
| 0.8277777777777778 | 12.257 |
| 0.8284722222222222 | 12.257 |
| 0.8291666666666666 | 7.887 |
| 0.8298611111111112 | 7.887 |
| 0.8305555555555556 | 7.887 |
| 0.8312499999999999 | 7.887 |
| 0.8319444444444444 | 7.887 |
| 0.8326388888888889 | 7.887 |
| 0.8333333333333334 | 7.887 |
| 0.8340277777777777 | 7.887 |
| 0.8347222222222223 | 7.887 |
| 0.8354166666666667 | 7.887 |
| 0.8361111111111111 | 7.887 |
| 0.8368055555555555 | 3.525 |
| 0.8375 | 3.525 |
| 0.8381944444444445 | 3.525 |
| 0.8388888888888889 | 3.525 |
| 0.8395833333333332 | 3.525 |
| 0.8402777777777778 | 3.525 |
| 0.8409722222222222 | 3.525 |
| 0.8416666666666667 | 3.525 |
| 0.842361111111111 | 3.525 |
| 0.8430555555555556 | 3.525 |
| 0.84375 | 0 |
| 0.8444444444444444 | 3.525 |
| 0.845138888888889 | 0 |
| 0.8458333333333333 | 0 |
| 0.8465277777777778 | 0 |
| 0.8472222222222222 | 0 |
| 0.8479166666666668 | 0 |
| 0.8486111111111111 | 0 |
| 0.8493055555555555 | 0 |
| 0.85 | 0 |
| 0.8506944444444445 | 0 |
| 0.8513888888888889 | 0 |
| 0.8520833333333333 | 0 |
| 0.8527777777777777 | 0 |
| 0.8534722222222223 | 0 |
| 0.8541666666666666 | 0 |
| 0.8548611111111111 | 0 |
| 0.8555555555555556 | 0 |
| 0.8562500000000001 | 0 |
| 0.8569444444444444 | 0 |
| 0.8576388888888888 | 0 |
| 0.8583333333333334 | 0 |
| 0.8590277777777778 | 0 |
| 0.8597222222222222 | 0 |
| 0.8604166666666666 | 0 |
| 0.8611111111111112 | 0 |
| 0.8618055555555556 | 0 |
| 0.8624999999999999 | 0 |
| 0.8631944444444444 | 0 |
| 0.8638888888888889 | 0 |
| 0.8645833333333334 | 0 |
| 0.8652777777777777 | 0 |
| 0.8659722222222223 | 0 |
| 0.8666666666666667 | 0 |
| 0.8673611111111111 | 0 |
| 0.8680555555555555 | 0 |
| 0.86875 | 0 |
| 0.8694444444444445 | 0 |
| 0.8701388888888889 | 0 |
| 0.8708333333333332 | 0 |
| 0.8715277777777778 | 0 |
| 0.8722222222222222 | 0 |
| 0.8729166666666667 | 0 |
| 0.873611111111111 | 0 |
| 0.8743055555555556 | 0 |
| 0.875 | 0 |
| 0.8756944444444444 | 0 |
| 0.876388888888889 | 0 |
| 0.8770833333333333 | 0 |
| 0.8777777777777778 | 0 |
| 0.8784722222222222 | 0 |
| 0.8791666666666668 | 0 |
| 0.8798611111111111 | 0 |
| 0.8805555555555555 | 0 |
| 0.88125 | 0 |
| 0.8819444444444445 | 0 |
| 0.8826388888888889 | 0 |
| 0.8833333333333333 | 0 |
| 0.8840277777777777 | 0 |
| 0.8847222222222223 | 0 |
| 0.8854166666666666 | 0 |
| 0.8861111111111111 | 0 |
| 0.8868055555555556 | 0 |
| 0.8875000000000001 | 0 |
| 0.8881944444444444 | 0 |
| 0.8888888888888888 | 0 |
| 0.8895833333333334 | 0 |
| 0.8902777777777778 | 0 |
| 0.8909722222222222 | 0 |
| 0.8916666666666666 | 0 |
| 0.8923611111111112 | 0 |
| 0.8930555555555556 | 0 |
| 0.8937499999999999 | 0 |
| 0.8944444444444444 | 0 |
| 0.8951388888888889 | 0 |
| 0.8958333333333334 | 0 |
| 0.8965277777777777 | 0 |
| 0.8972222222222223 | 0 |
| 0.8979166666666667 | 0 |
| 0.8986111111111111 | 0 |
| 0.8993055555555555 | 0 |
| 0.9 | 0 |
| 0.9006944444444445 | 0 |
| 0.9013888888888889 | 0 |
| 0.9020833333333332 | 0 |
| 0.9027777777777778 | 0 |
| 0.9034722222222222 | 0 |
| 0.9041666666666667 | 0 |
| 0.904861111111111 | 0 |
| 0.9055555555555556 | 0 |
| 0.90625 | 0 |
| 0.9069444444444444 | 0 |
| 0.907638888888889 | 0 |
| 0.9083333333333333 | 0 |
| 0.9090277777777778 | 0 |
| 0.9097222222222222 | 0 |
| 0.9104166666666668 | 0 |
| 0.9111111111111111 | 0 |
| 0.9118055555555555 | 0 |
| 0.9125 | 0 |
| 0.9131944444444445 | 0 |
| 0.9138888888888889 | 0 |
| 0.9145833333333333 | 0 |
| 0.9152777777777777 | 0 |
| 0.9159722222222223 | 0 |
| 0.9166666666666666 | 0 |
| 0.9173611111111111 | 0 |
| 0.9180555555555556 | 0 |
| 0.9187500000000001 | 0 |
| 0.9194444444444444 | 0 |
| 0.9201388888888888 | 0 |
| 0.9208333333333334 | 0 |
| 0.9215277777777778 | 0 |
| 0.9222222222222222 | 0 |
| 0.9229166666666666 | 0 |
| 0.9236111111111112 | 0 |
| 0.9243055555555556 | 0 |
| 0.9249999999999999 | 0 |
| 0.9256944444444444 | 0 |
| 0.9263888888888889 | 0 |
| 0.9270833333333334 | 0 |
| 0.9277777777777777 | 0 |
| 0.9284722222222223 | 0 |
| 0.9291666666666667 | 0 |
| 0.9298611111111111 | 0 |
| 0.9305555555555555 | 0 |
| 0.93125 | 0 |
| 0.9319444444444445 | 0 |
| 0.9326388888888889 | 0 |
| 0.9333333333333332 | 0 |
| 0.9340277777777778 | 0 |
| 0.9347222222222222 | 0 |
| 0.9354166666666667 | 0 |
| 0.936111111111111 | 0 |
| 0.9368055555555556 | 0 |
| 0.9375 | 0 |
| 0.9381944444444444 | 0 |
| 0.938888888888889 | 0 |
| 0.9395833333333333 | 0 |
| 0.9402777777777778 | 0 |
| 0.9409722222222222 | 0 |
| 0.9416666666666668 | 0 |
| 0.9423611111111111 | 0 |
| 0.9430555555555555 | 0 |
| 0.94375 | 0 |
| 0.9444444444444445 | 0 |
| 0.9451388888888889 | 0 |
| 0.9458333333333333 | 0 |
| 0.9465277777777777 | 0 |
| 0.9472222222222223 | 0 |
| 0.9479166666666666 | 0 |
| 0.9486111111111111 | 0 |
| 0.9493055555555556 | 0 |
| 0.9500000000000001 | 0 |
| 0.9506944444444444 | 0 |
| 0.9513888888888888 | 0 |
| 0.9520833333333334 | 0 |
| 0.9527777777777778 | 0 |
| 0.9534722222222222 | 0 |
| 0.9541666666666666 | 0 |
| 0.9548611111111112 | 0 |
| 0.9555555555555556 | 0 |
| 0.9562499999999999 | 0 |
| 0.9569444444444444 | 0 |
| 0.9576388888888889 | 0 |
| 0.9583333333333334 | 0 |
| 0.9590277777777777 | 0 |
| 0.9597222222222223 | 0 |
| 0.9604166666666667 | 0 |
| 0.9611111111111111 | 0 |
| 0.9618055555555555 | 0 |
| 0.9625 | 0 |
| 0.9631944444444445 | 0 |
| 0.9638888888888889 | 0 |
| 0.9645833333333332 | 0 |
| 0.9652777777777778 | 0 |
| 0.9659722222222222 | 0 |
| 0.9666666666666667 | 0 |
| 0.967361111111111 | 0 |
| 0.9680555555555556 | 0 |
| 0.96875 | 0 |
| 0.9694444444444444 | 0 |
| 0.970138888888889 | 0 |
| 0.9708333333333333 | 0 |
| 0.9715277777777778 | 0 |
| 0.9722222222222222 | 0 |
| 0.9729166666666668 | 0 |
| 0.9736111111111111 | 0 |
| 0.9743055555555555 | 0 |
| 0.975 | 0 |
| 0.9756944444444445 | 0 |
| 0.9763888888888889 | 0 |
| 0.9770833333333333 | 0 |
| 0.9777777777777777 | 0 |
| 0.9784722222222223 | 0 |
| 0.9791666666666666 | 0 |
| 0.9798611111111111 | 0 |
| 0.9805555555555556 | 0 |
| 0.9812500000000001 | 0 |
| 0.9819444444444444 | 0 |
| 0.9826388888888888 | 0 |
| 0.9833333333333334 | 0 |
| 0.9840277777777778 | 0 |
| 0.9847222222222222 | 0 |
| 0.9854166666666666 | 0 |
| 0.9861111111111112 | 0 |
| 0.9868055555555556 | 0 |
| 0.9874999999999999 | 0 |
| 0.9881944444444444 | 0 |
| 0.9888888888888889 | 0 |
| 0.9895833333333334 | 0 |
| 0.9902777777777777 | 0 |
| 0.9909722222222223 | 0 |
| 0.9916666666666667 | 0 |
| 0.9923611111111111 | 0 |
| 0.9930555555555555 | 0 |
| 0.99375 | 0 |
| 0.9944444444444445 | 0 |
| 0.9951388888888889 | 0 |
| 0.9958333333333332 | 0 |
| 0.9965277777777778 | 0 |
| 0.9972222222222222 | 0 |
| 0.9979166666666667 | 0 |
| 0.998611111111111 | 0 |
| 0.9993055555555556 | 0 |